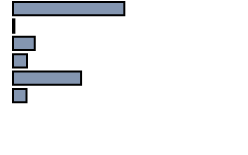
| Category | Series 0 |
|---|---|
| 0 | 48.4 |
| 1 | 0.6 |
| 2 | 9.5 |
| 3 | 6.1 |
| 4 | 29.6 |
| 5 | 5.9 |
| 6 | 0 |
| 7 | 0 |